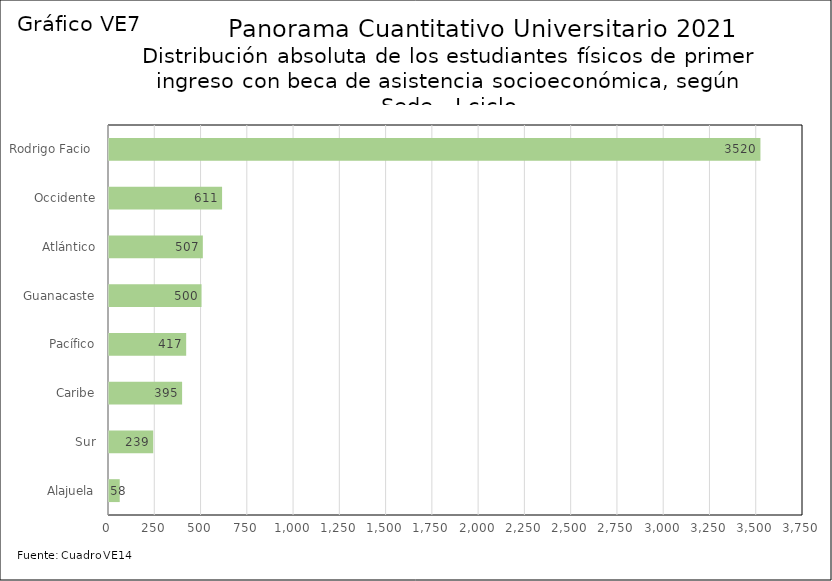
| Category | Series 0 |
|---|---|
| Alajuela | 58 |
| Sur | 239 |
| Caribe | 395 |
| Pacífico | 417 |
| Guanacaste | 500 |
| Atlántico | 507 |
| Occidente | 611 |
| Rodrigo Facio  | 3520 |